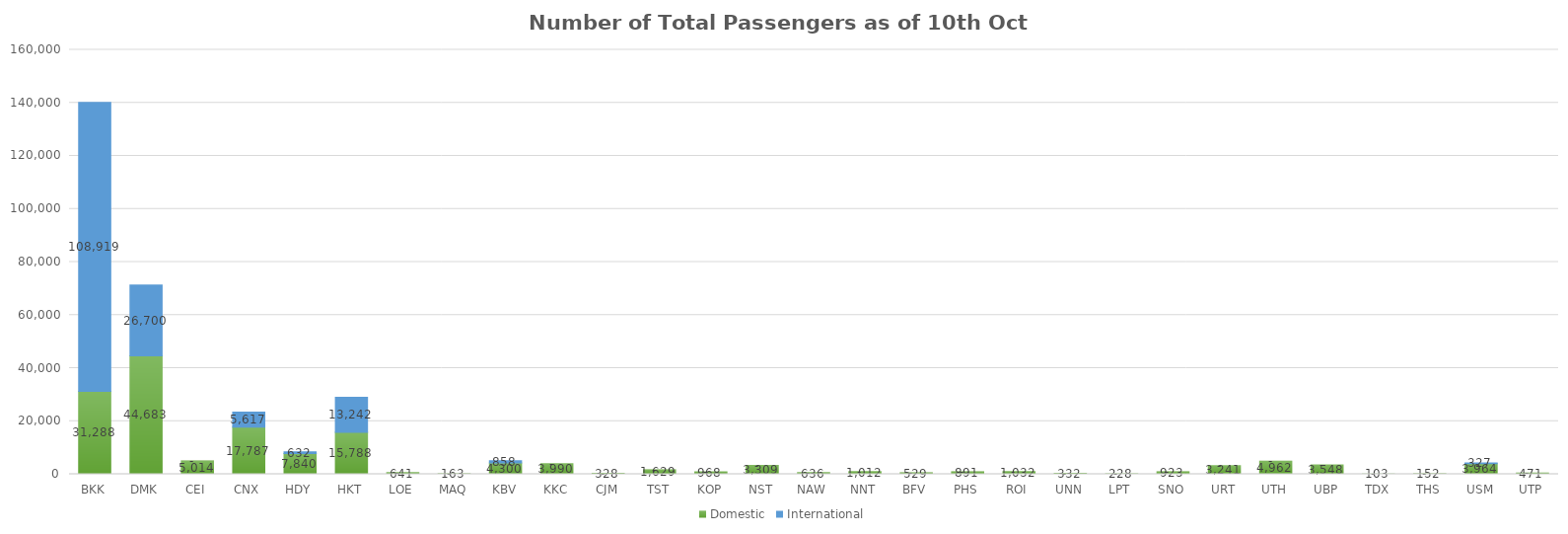
| Category | Domestic | International |
|---|---|---|
| BKK | 31288 | 108919 |
| DMK | 44683 | 26700 |
| CEI | 5014 | 0 |
| CNX | 17787 | 5617 |
| HDY | 7840 | 632 |
| HKT | 15788 | 13242 |
| LOE | 641 | 0 |
| MAQ | 163 | 0 |
| KBV | 4300 | 858 |
| KKC | 3990 | 0 |
| CJM | 328 | 0 |
| TST | 1629 | 0 |
| KOP | 968 | 0 |
| NST | 3309 | 0 |
| NAW | 636 | 0 |
| NNT | 1012 | 0 |
| BFV | 529 | 0 |
| PHS | 891 | 0 |
| ROI | 1032 | 0 |
| UNN | 332 | 0 |
| LPT | 228 | 0 |
| SNO | 923 | 0 |
| URT | 3241 | 0 |
| UTH | 4962 | 0 |
| UBP | 3548 | 0 |
| TDX | 103 | 0 |
| THS | 152 | 0 |
| USM | 3964 | 327 |
| UTP | 471 | 0 |